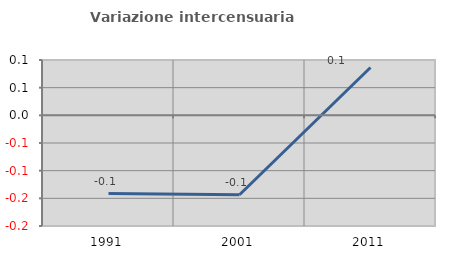
| Category | Variazione intercensuaria annua |
|---|---|
| 1991.0 | -0.141 |
| 2001.0 | -0.144 |
| 2011.0 | 0.086 |